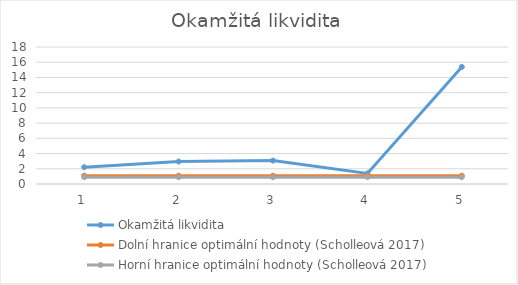
| Category | Okamžitá likvidita | Dolní hranice optimální hodnoty (Scholleová 2017) | Horní hranice optimální hodnoty (Scholleová 2017) |
|---|---|---|---|
| 0 | 2.207 | 1.1 | 0.9 |
| 1 | 2.952 | 1.1 | 0.9 |
| 2 | 3.075 | 1.1 | 0.9 |
| 3 | 1.392 | 1.1 | 0.9 |
| 4 | 15.38 | 1.1 | 0.9 |